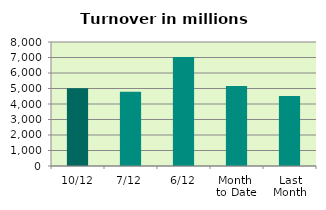
| Category | Series 0 |
|---|---|
| 10/12 | 5022.749 |
| 7/12 | 4794.098 |
| 6/12 | 7036.426 |
| Month 
to Date | 5153.522 |
| Last
Month | 4514.728 |